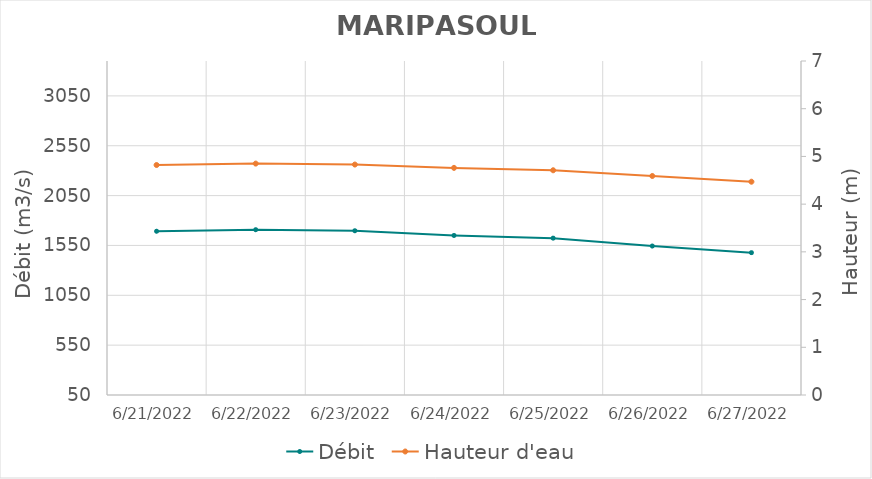
| Category | Débit |
|---|---|
| 4/26/22 | 2674.62 |
| 4/25/22 | 2596.45 |
| 4/24/22 | 2479.48 |
| 4/23/22 | 2375.34 |
| 4/22/22 | 2270.87 |
| 4/21/22 | 2161.79 |
| 4/20/22 | 2150.66 |